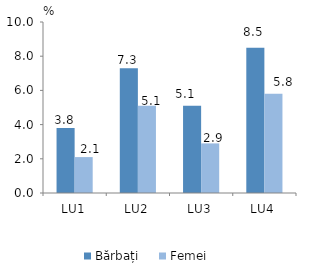
| Category | Bărbați | Femei |
|---|---|---|
| LU1 | 3.8 | 2.1 |
| LU2 | 7.3 | 5.1 |
| LU3 | 5.1 | 2.9 |
| LU4 | 8.5 | 5.8 |